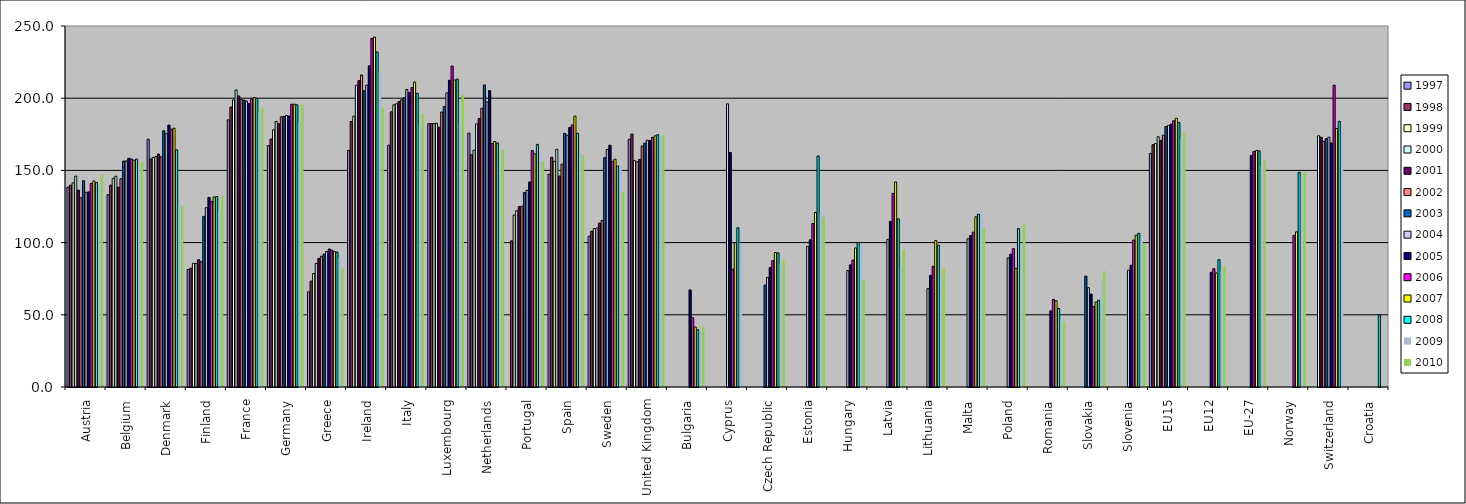
| Category | 1997 | 1998 | 1999 | 2000 | 2001 | 2002 | 2003 | 2004 | 2005 | 2006 | 2007 | 2008 | 2009 | 2010 |
|---|---|---|---|---|---|---|---|---|---|---|---|---|---|---|
| Austria | 138.428 | 139.781 | 141.386 | 146.039 | 136.36 | 131.033 | 142.829 | 134.832 | 135.078 | 141.057 | 142.703 | 141.555 | 139.138 | 146.962 |
| Belgium | 133.196 | 139.798 | 144.511 | 145.962 | 138.388 | 144.221 | 156.474 | 156.596 | 158.365 | 157.901 | 157.072 | 157.813 | 152.112 | 155.532 |
| Denmark | 171.579 | 157.974 | 158.98 | 159.61 | 161.346 | 159.361 | 177.49 | 175.57 | 181.386 | 178.562 | 179.249 | 164.219 | 125.645 | 125.381 |
| Finland | 81.384 | 82.294 | 85.684 | 85.487 | 88.107 | 86.778 | 118.166 | 124.231 | 131.301 | 128.554 | 131.547 | 131.893 | 122.46 | 132.346 |
| France | 185.022 | 193.866 | 198.818 | 205.704 | 201.563 | 199.127 | 198.681 | 198.024 | 196.201 | 199.693 | 200.502 | 199.881 | 190.286 | 193.462 |
| Germany | 167.16 | 171.733 | 178.158 | 183.929 | 182.366 | 187.113 | 187.387 | 188.047 | 187.591 | 195.842 | 195.858 | 195.406 | 183.781 | 195.625 |
| Greece | 65.958 | 73.356 | 78.612 | 85.597 | 88.996 | 90.53 | 91.985 | 93.837 | 95.552 | 94.722 | 93.811 | 93.441 | 89.34 | 82.034 |
| Ireland | 163.9 | 183.879 | 187.504 | 208.978 | 212.175 | 216.069 | 205.144 | 209.055 | 222.414 | 241.406 | 242.361 | 232 | 218.085 | 193.317 |
| Italy | 167.498 | 190.593 | 195.41 | 196.133 | 197.658 | 198.872 | 200.271 | 206.091 | 203.948 | 207.317 | 211.215 | 203.386 | 180.454 | 189.111 |
| Luxembourg | 182.401 | 182.472 | 182.382 | 182.675 | 179.922 | 190.401 | 194.272 | 203.696 | 212.47 | 222.306 | 212.589 | 213.212 | 183.333 | 202.137 |
| Netherlands | 175.841 | 160.754 | 163.988 | 182.286 | 185.963 | 193.016 | 209.179 | 197.399 | 205.21 | 168.542 | 170.007 | 169.042 | 152.961 | 164.344 |
| Portugal | 0 | 101.194 | 119.07 | 122.069 | 124.883 | 125.214 | 134.686 | 136.19 | 142.01 | 163.715 | 161.502 | 168.027 | 161.7 | 156.452 |
| Spain | 147.406 | 159.068 | 156.288 | 164.618 | 146.131 | 154.284 | 175.58 | 174.36 | 179.695 | 181.492 | 187.614 | 175.744 | 161.72 | 160.682 |
| Sweden | 104.385 | 107.92 | 109.733 | 110.098 | 113.552 | 115.338 | 158.806 | 164.511 | 167.459 | 156.364 | 157.732 | 152.961 | 152.742 | 135.095 |
| United Kingdom | 171.534 | 175.15 | 156.78 | 155.877 | 157.574 | 166.829 | 168.877 | 170.876 | 170.698 | 172.806 | 173.973 | 174.684 | 174.513 | 174.518 |
| Bulgaria | 0 | 0 | 0 | 0 | 0 | 0 | 0 | 0 | 67.209 | 47.921 | 41.558 | 39.642 | 40.063 | 42.466 |
| Cyprus | 0 | 0 | 0 | 0 | 0 | 0 | 0 | 196.082 | 162.4 | 81.633 | 99.873 | 110.288 | 99.696 | 0 |
| Czech Republic | 0 | 0 | 0 | 0 | 0 | 0 | 70.553 | 75.957 | 82.792 | 87.512 | 93.155 | 92.824 | 85.281 | 87.822 |
| Estonia | 0 | 0 | 0 | 0 | 0 | 0 | 0 | 97.363 | 101.916 | 113.234 | 120.927 | 159.972 | 120.557 | 117.83 |
| Hungary | 0 | 0 | 0 | 0 | 0 | 0 | 0 | 80.636 | 84.568 | 87.869 | 96.27 | 100.076 | 97.56 | 74.315 |
| Latvia | 0 | 0 | 0 | 0 | 0 | 0 | 0 | 102.299 | 114.684 | 134.111 | 141.963 | 116.47 | 82.588 | 95.138 |
| Lithuania | 0 | 0 | 0 | 0 | 0 | 0 | 0 | 68.096 | 77.326 | 83.578 | 101.426 | 98.176 | 78.068 | 81.849 |
| Malta | 0 | 0 | 0 | 0 | 0 | 0 | 0 | 102.665 | 104.827 | 107.203 | 117.812 | 119.643 | 122.085 | 110.401 |
| Poland | 0 | 0 | 0 | 0 | 0 | 0 | 0 | 89.387 | 91.942 | 95.82 | 82.205 | 109.687 | 99.082 | 112.478 |
| Romania | 0 | 0 | 0 | 0 | 0 | 0 | 0 | 0 | 52.733 | 60.654 | 59.731 | 54.417 | 46.493 | 45.426 |
| Slovakia | 0 | 0 | 0 | 0 | 0 | 0 | 76.818 | 68.814 | 64.359 | 55.74 | 58.874 | 60.098 | 72.953 | 80.433 |
| Slovenia | 0 | 0 | 0 | 0 | 0 | 0 | 0 | 80.874 | 84.295 | 101.742 | 105.09 | 106.421 | 101.484 | 99.543 |
| EU15 | 161.8 | 167.8 | 168.6 | 173.3 | 170.8 | 174.4 | 180.4 | 181.2 | 182 | 184.4 | 186.1 | 183.1 | 172 | 175.99 |
| EU12 | 0 | 0 | 0 | 0 | 0 | 0 | 0 | 0 | 79.406 | 81.944 | 78.92 | 88.188 | 80.284 | 83.753 |
| EU-27 | 0 | 0 | 0 | 0 | 0 | 0 | 0 | 0 | 160.4 | 163 | 163.8 | 163.5 | 153.1 | 156.992 |
| Norway | 0 | 0 | 0 | 0 | 0 | 0 | 0 | 0 | 0 | 104.973 | 107.428 | 148.648 | 146.046 | 148.62 |
| Switzerland | 0 | 0 | 0 | 174 | 173 | 170 | 172 | 173 | 169 | 209 | 179 | 184 | 176 | 0 |
| Croatia | 0 | 0 | 0 | 0 | 0 | 0 | 0 | 0 | 0 | 0 | 0 | 50 | 0 | 0 |